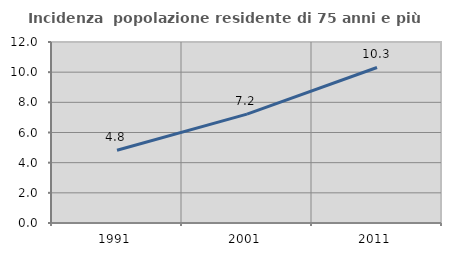
| Category | Incidenza  popolazione residente di 75 anni e più |
|---|---|
| 1991.0 | 4.826 |
| 2001.0 | 7.216 |
| 2011.0 | 10.311 |